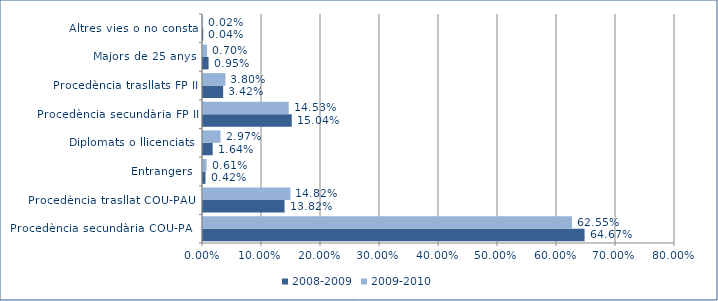
| Category | 2008-2009 | 2009-2010 |
|---|---|---|
| Procedència secundària COU-PAU | 0.647 | 0.626 |
| Procedència trasllat COU-PAU  | 0.138 | 0.148 |
| Entrangers | 0.004 | 0.006 |
| Diplomats o llicenciats | 0.016 | 0.03 |
| Procedència secundària FP II | 0.15 | 0.145 |
| Procedència trasllats FP II | 0.034 | 0.038 |
| Majors de 25 anys | 0.009 | 0.007 |
| Altres vies o no consta | 0 | 0 |